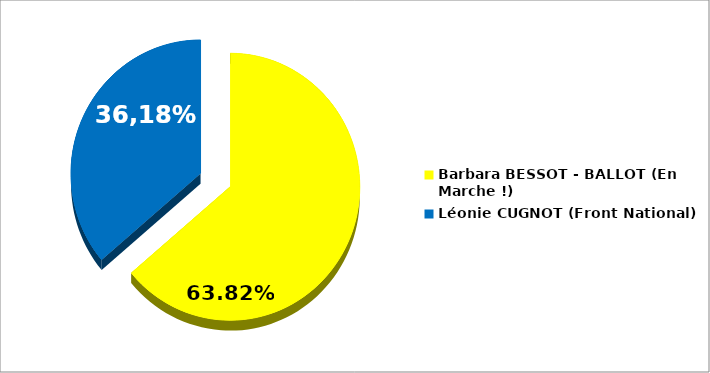
| Category | candidats |
|---|---|
| Barbara BESSOT - BALLOT (En Marche !) | 0.638 |
| Léonie CUGNOT (Front National) | 0.362 |